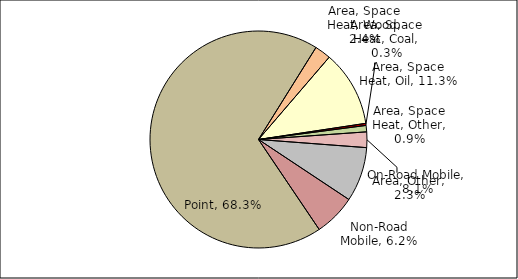
| Category | Series 0 |
|---|---|
| Point | 0.683 |
| Area, Space Heat, Wood | 0.024 |
| Area, Space Heat, Oil | 0.113 |
| Area, Space Heat, Coal | 0.003 |
| Area, Space Heat, Other | 0.009 |
| Area, Other | 0.023 |
| On-Road Mobile | 0.081 |
| Non-Road Mobile | 0.062 |